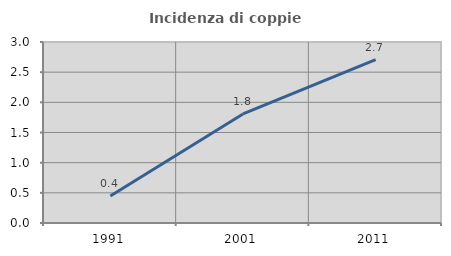
| Category | Incidenza di coppie miste |
|---|---|
| 1991.0 | 0.448 |
| 2001.0 | 1.808 |
| 2011.0 | 2.709 |